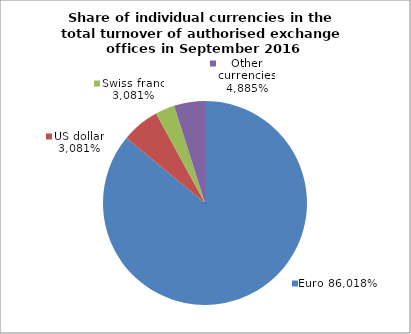
| Category | EUR |
|---|---|
| 0.716079492598274 | 0.86 |
| 0.2839199572999224 | 0.06 |
| 5.501018035729667e-07 | 0.031 |